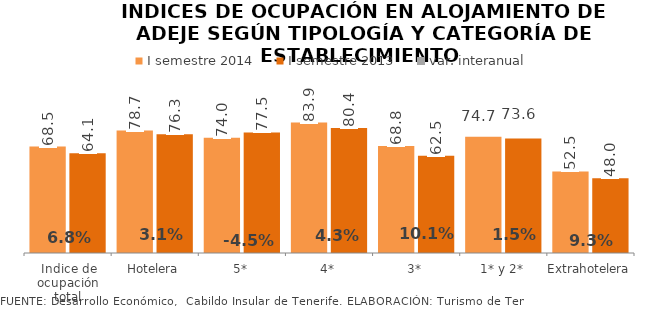
| Category | I semestre 2014 | I semestre 2013 |
|---|---|---|
| Indice de ocupación total | 68.456 | 64.077 |
| Hotelera | 78.709 | 76.312 |
| 5* | 74.025 | 77.529 |
| 4* | 83.875 | 80.404 |
| 3* | 68.799 | 62.489 |
| 1* y 2* | 74.691 | 73.589 |
| Extrahotelera | 52.451 | 47.993 |